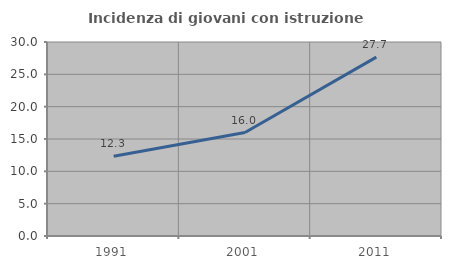
| Category | Incidenza di giovani con istruzione universitaria |
|---|---|
| 1991.0 | 12.347 |
| 2001.0 | 16.004 |
| 2011.0 | 27.668 |